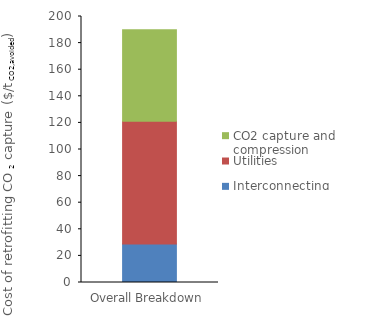
| Category | Interconnecting | Utilities | CO2 capture and compression |
|---|---|---|---|
| 0 | 28.979 | 92.197 | 68.946 |